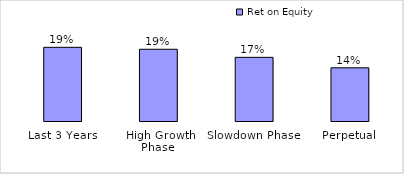
| Category | Ret on Equity |
|---|---|
| Last 3 Years | 0.194 |
| High Growth Phase  | 0.189 |
| Slowdown Phase | 0.168 |
| Perpetual | 0.14 |